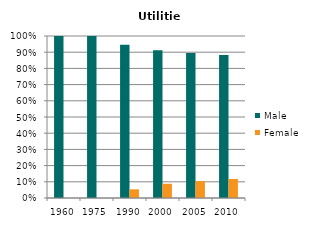
| Category | Male | Female |
|---|---|---|
| 1960.0 | 1 | 0 |
| 1975.0 | 1 | 0 |
| 1990.0 | 0.946 | 0.054 |
| 2000.0 | 0.912 | 0.088 |
| 2005.0 | 0.896 | 0.104 |
| 2010.0 | 0.882 | 0.118 |